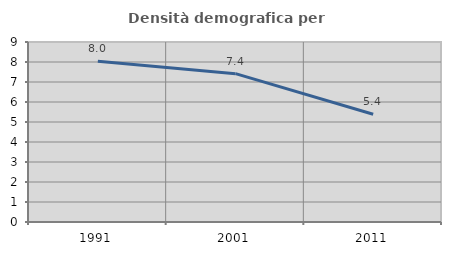
| Category | Densità demografica |
|---|---|
| 1991.0 | 8.042 |
| 2001.0 | 7.417 |
| 2011.0 | 5.387 |